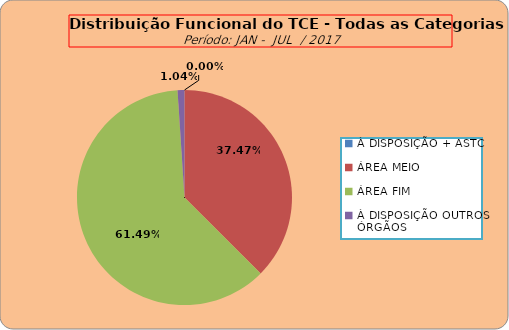
| Category | Series 0 |
|---|---|
| À DISPOSIÇÃO + ASTC | 0 |
| ÁREA MEIO | 181 |
| ÁREA FIM | 297 |
| À DISPOSIÇÃO OUTROS ÓRGÃOS | 5 |